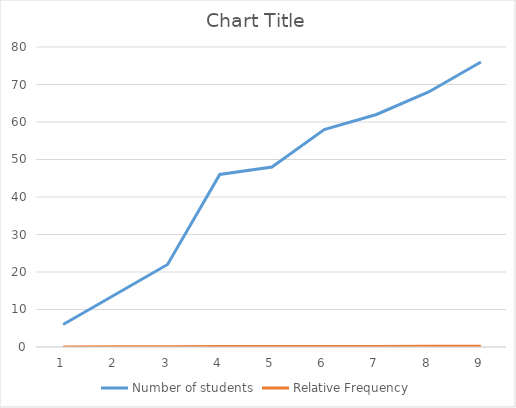
| Category | Number of students | Relative Frequency |
|---|---|---|
| 0 | 6 | 0.02 |
| 1 | 14 | 0.04 |
| 2 | 22 | 0.06 |
| 3 | 46 | 0.12 |
| 4 | 48 | 0.12 |
| 5 | 58 | 0.15 |
| 6 | 62 | 0.16 |
| 7 | 68 | 0.17 |
| 8 | 76 | 0.19 |